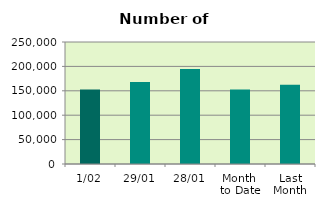
| Category | Series 0 |
|---|---|
| 1/02 | 152858 |
| 29/01 | 168254 |
| 28/01 | 194564 |
| Month 
to Date | 152858 |
| Last
Month | 162275.9 |